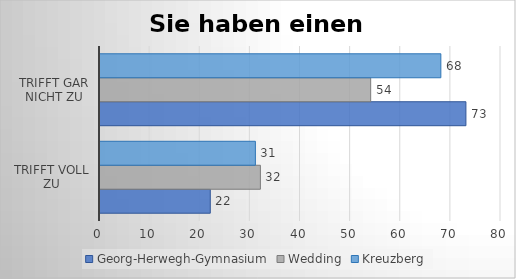
| Category | Georg-Herwegh-Gymnasium | Wedding | Kreuzberg |
|---|---|---|---|
| trifft voll zu | 22 | 32 | 31 |
| trifft gar nicht zu | 73 | 54 | 68 |